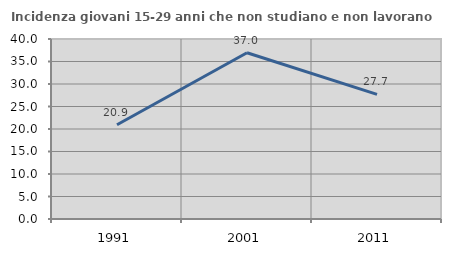
| Category | Incidenza giovani 15-29 anni che non studiano e non lavorano  |
|---|---|
| 1991.0 | 20.932 |
| 2001.0 | 36.952 |
| 2011.0 | 27.698 |